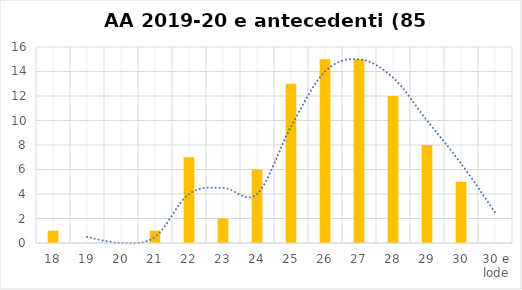
| Category | Series 0 |
|---|---|
| 18 | 1 |
| 19 | 0 |
| 20 | 0 |
| 21 | 1 |
| 22 | 7 |
| 23 | 2 |
| 24 | 6 |
| 25 | 13 |
| 26 | 15 |
| 27 | 15 |
| 28 | 12 |
| 29 | 8 |
| 30 | 5 |
| 30 e lode | 0 |